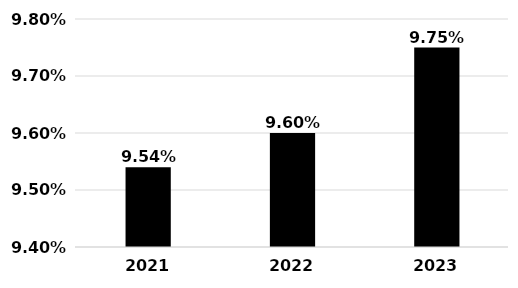
| Category | Avg. Authorized ROE |
|---|---|
| 2021.0 | 0.095 |
| 2022.0 | 0.096 |
| 2023.0 | 0.098 |